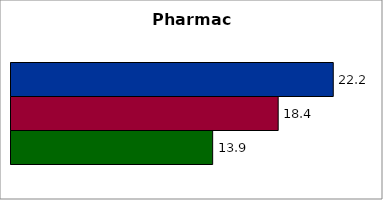
| Category | 50 states and D.C. | SREB states | State |
|---|---|---|---|
| 0 | 22.195 | 18.401 | 13.889 |